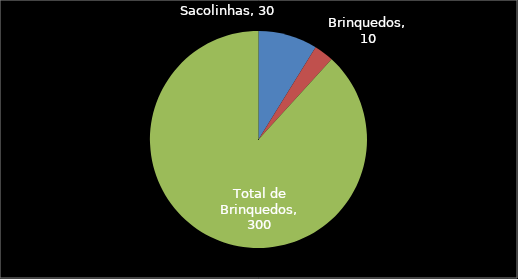
| Category | Series 0 |
|---|---|
| Sacolinhas | 30 |
| Brinquedos | 10 |
| Total de Brinquedos | 300 |